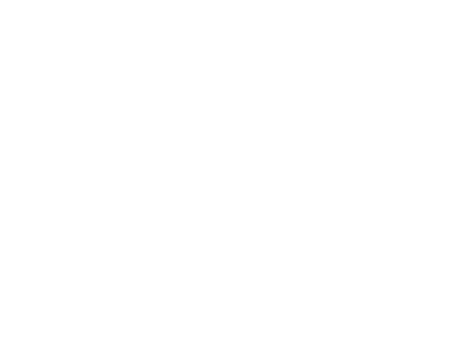
| Category | Non native |
|---|---|
| No invasive species | 0.452 |
| Invasive species ≤ 10% cover BUT NO Rhodo/Laurel present | 0.002 |
| Invasive species > 10% cover BUT NO Rhodo/Laurel present | 0 |
| Invasive species ≤ 10% cover AND Rhodo/Laurel present | 0.019 |
| Invasive species > 10% cover AND Rhodo/Laurel present | 0.007 |